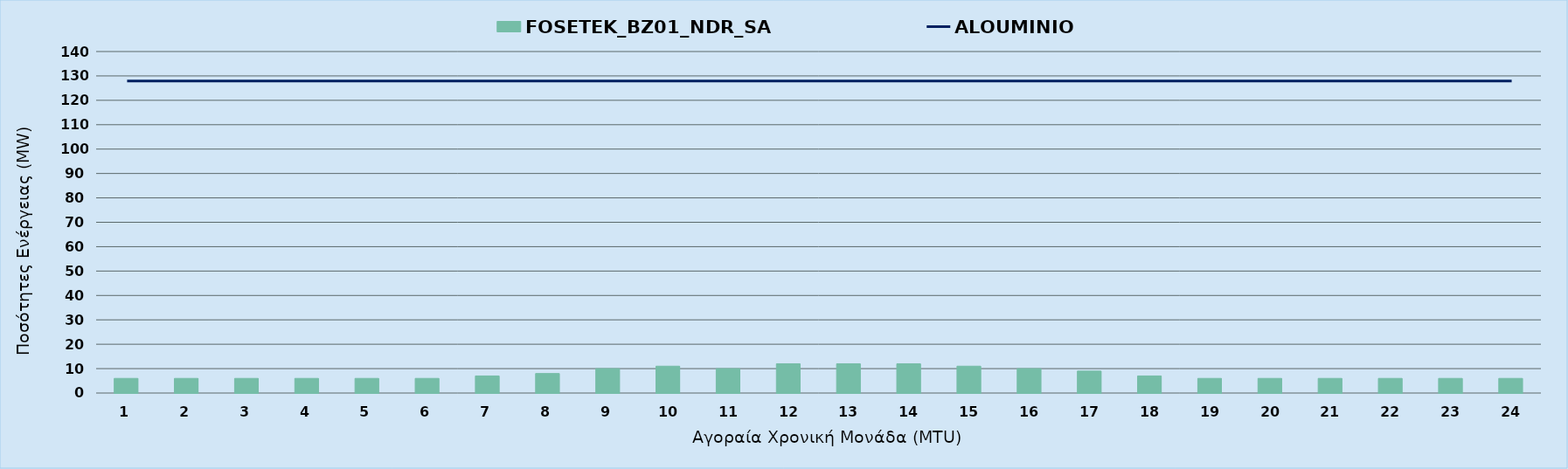
| Category | FOSETEK_BZ01_NDR_SA |
|---|---|
| 0 | 6 |
| 1 | 6 |
| 2 | 6 |
| 3 | 6 |
| 4 | 6 |
| 5 | 6 |
| 6 | 7 |
| 7 | 8 |
| 8 | 10 |
| 9 | 11 |
| 10 | 10 |
| 11 | 12 |
| 12 | 12 |
| 13 | 12 |
| 14 | 11 |
| 15 | 10 |
| 16 | 9 |
| 17 | 7 |
| 18 | 6 |
| 19 | 6 |
| 20 | 6 |
| 21 | 6 |
| 22 | 6 |
| 23 | 6 |